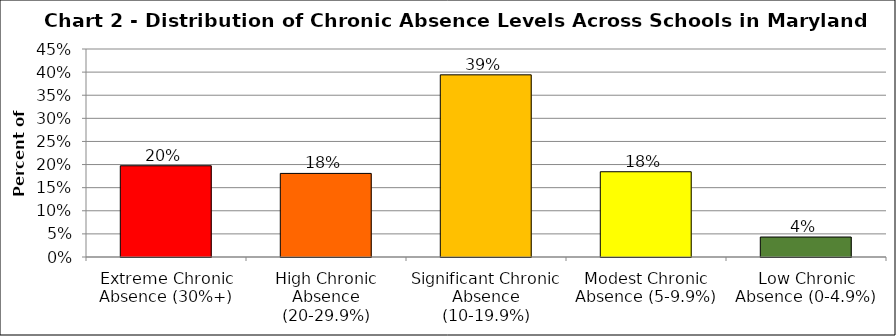
| Category | Series 1 |
|---|---|
| Extreme Chronic Absence (30%+) | 0.197 |
| High Chronic Absence (20-29.9%) | 0.181 |
| Significant Chronic Absence (10-19.9%) | 0.394 |
| Modest Chronic Absence (5-9.9%) | 0.184 |
| Low Chronic Absence (0-4.9%) | 0.043 |